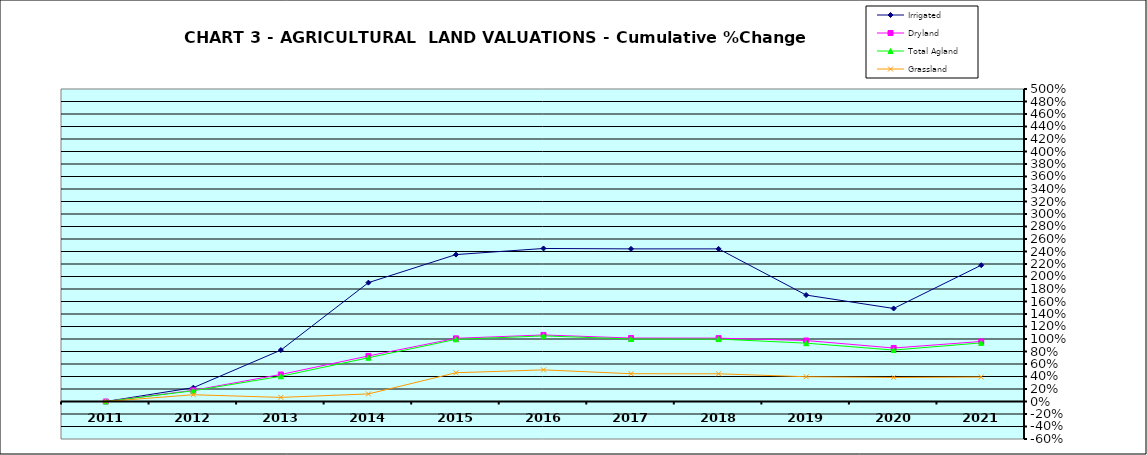
| Category | Irrigated | Dryland | Total Agland | Grassland |
|---|---|---|---|---|
| 2011.0 | 0 | 0 | 0 | 0 |
| 2012.0 | 0.221 | 0.179 | 0.172 | 0.108 |
| 2013.0 | 0.822 | 0.432 | 0.403 | 0.066 |
| 2014.0 | 1.902 | 0.729 | 0.7 | 0.121 |
| 2015.0 | 2.351 | 1.011 | 0.995 | 0.46 |
| 2016.0 | 2.448 | 1.065 | 1.05 | 0.506 |
| 2017.0 | 2.442 | 1.015 | 1 | 0.445 |
| 2018.0 | 2.442 | 1.014 | 0.999 | 0.443 |
| 2019.0 | 1.703 | 0.976 | 0.933 | 0.396 |
| 2020.0 | 1.488 | 0.856 | 0.823 | 0.385 |
| 2021.0 | 2.18 | 0.96 | 0.938 | 0.392 |